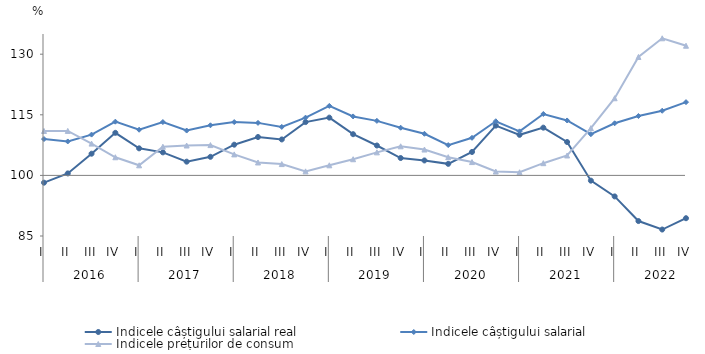
| Category | Indicele câștigului salarial real | Indicele câștigului salarial | Indicele prețurilor de consum |
|---|---|---|---|
| 0 | 98.2 | 109 | 111 |
| 1 | 100.491 | 108.4 | 111.01 |
| 2 | 105.369 | 110.1 | 107.87 |
| 3 | 110.537 | 113.3 | 104.49 |
| 4 | 106.7 | 111.3 | 102.5 |
| 5 | 105.7 | 113.2 | 107.1 |
| 6 | 103.4 | 111.1 | 107.4 |
| 7 | 104.6 | 112.4 | 107.5 |
| 8 | 107.6 | 113.2 | 105.2 |
| 9 | 109.5 | 113 | 103.2 |
| 10 | 108.9 | 112 | 102.8 |
| 11 | 113.2 | 114.3 | 101 |
| 12 | 114.3 | 117.2 | 102.5 |
| 13 | 110.2 | 114.6 | 104 |
| 14 | 107.4 | 113.5 | 105.7 |
| 15 | 104.3 | 111.8 | 107.2 |
| 16 | 103.7 | 110.3 | 106.4 |
| 17 | 102.861 | 107.5 | 104.51 |
| 18 | 105.8 | 109.3 | 103.3 |
| 19 | 112.322 | 113.4 | 100.96 |
| 20 | 110.042 | 110.9 | 100.78 |
| 21 | 111.816 | 115.2 | 103.026 |
| 22 | 108.263 | 113.6 | 104.93 |
| 23 | 98.7 | 110.2 | 111.7 |
| 24 | 94.8 | 112.9 | 119.1 |
| 25 | 88.7 | 114.7 | 129.32 |
| 26 | 86.6 | 116 | 133.938 |
| 27 | 89.4 | 118.136 | 132.1 |